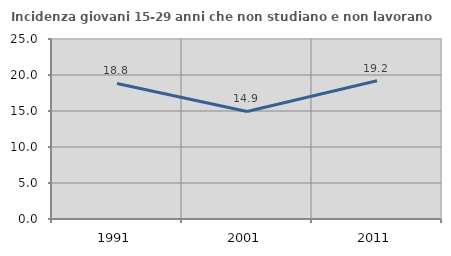
| Category | Incidenza giovani 15-29 anni che non studiano e non lavorano  |
|---|---|
| 1991.0 | 18.826 |
| 2001.0 | 14.936 |
| 2011.0 | 19.211 |